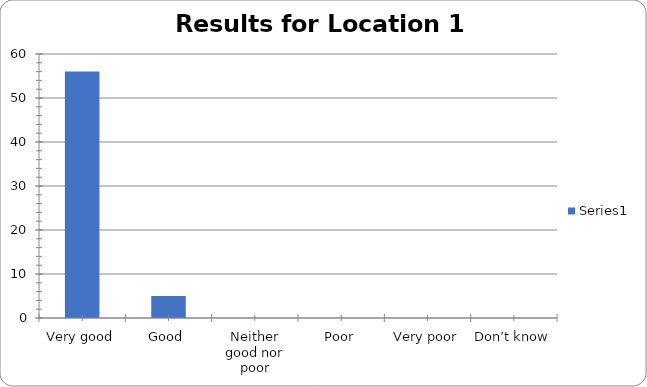
| Category | Series 0 |
|---|---|
| Very good | 56 |
| Good | 5 |
| Neither good nor poor | 0 |
| Poor | 0 |
| Very poor | 0 |
| Don’t know | 0 |